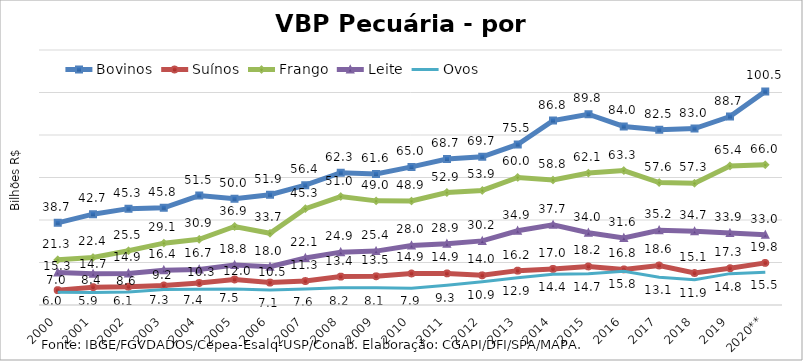
| Category | Bovinos | Suínos | Frango | Leite | Ovos |
|---|---|---|---|---|---|
| 2000 | 38.657 | 7 | 21.271 | 15.269 | 5.97 |
| 2001 | 42.732 | 8.397 | 22.358 | 14.693 | 5.883 |
| 2002 | 45.347 | 8.607 | 25.521 | 14.878 | 6.061 |
| 2003 | 45.767 | 9.198 | 29.096 | 16.384 | 7.332 |
| 2004 | 51.493 | 10.342 | 30.896 | 16.745 | 7.431 |
| 2005 | 49.992 | 11.99 | 36.938 | 18.834 | 7.481 |
| 2006 | 51.904 | 10.547 | 33.745 | 17.989 | 7.107 |
| 2007 | 56.408 | 11.278 | 45.339 | 22.115 | 7.553 |
| 2008 | 62.281 | 13.355 | 51.037 | 24.879 | 8.157 |
| 2009 | 61.632 | 13.5 | 49.003 | 25.364 | 8.133 |
| 2010 | 64.978 | 14.851 | 48.944 | 28.011 | 7.91 |
| 2011 | 68.692 | 14.874 | 52.935 | 28.876 | 9.321 |
| 2012 | 69.716 | 13.966 | 53.923 | 30.174 | 10.926 |
| 2013 | 75.547 | 16.171 | 60.017 | 34.918 | 12.851 |
| 2014 | 86.79 | 16.984 | 58.803 | 37.706 | 14.439 |
| 2015 | 89.777 | 18.151 | 62.078 | 34.036 | 14.701 |
| 2016 | 84.036 | 16.751 | 63.253 | 31.582 | 15.849 |
| 2017 | 82.467 | 18.595 | 57.612 | 35.189 | 13.064 |
| 2018 | 83.019 | 15.059 | 57.298 | 34.666 | 11.879 |
| 2019 | 88.657 | 17.296 | 65.431 | 33.851 | 14.762 |
| 2020** | 100.519 | 19.814 | 65.988 | 33.013 | 15.454 |